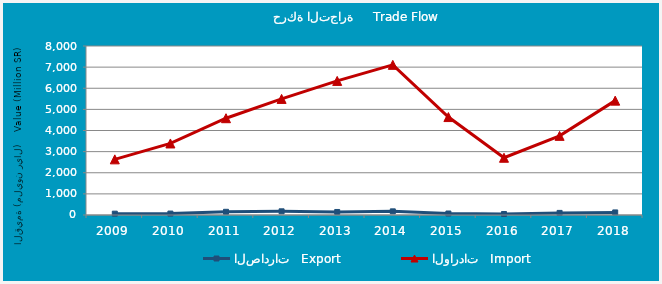
| Category | الصادرات   Export | الواردات   Import |
|---|---|---|
| 2009.0 | 63256872 | 2633970335 |
| 2010.0 | 67320482 | 3386403517 |
| 2011.0 | 151147679 | 4581793282 |
| 2012.0 | 174336076 | 5495310488 |
| 2013.0 | 143418454 | 6347571250 |
| 2014.0 | 172575217 | 7107331977 |
| 2015.0 | 70341711 | 4635545684 |
| 2016.0 | 47389018 | 2709341058 |
| 2017.0 | 99751600 | 3745597219 |
| 2018.0 | 121527563 | 5413500880 |